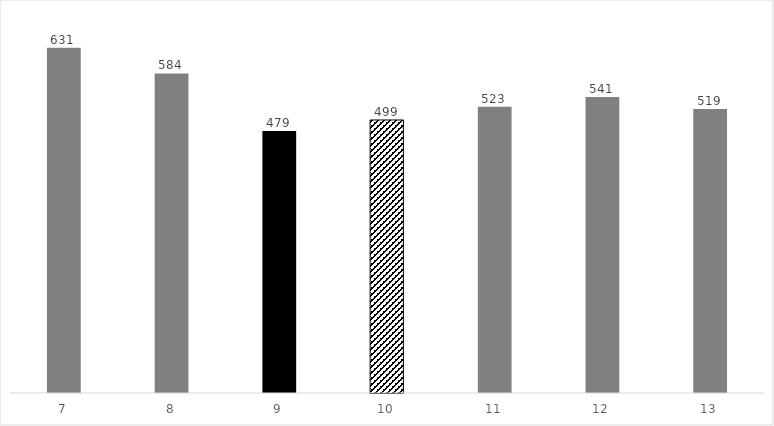
| Category | Ergebnis |
|---|---|
| 7 | 631 |
| 8 | 584 |
| 9 | 479 |
| 10 | 499 |
| 11 | 523 |
| 12 | 541 |
| 13 | 519 |